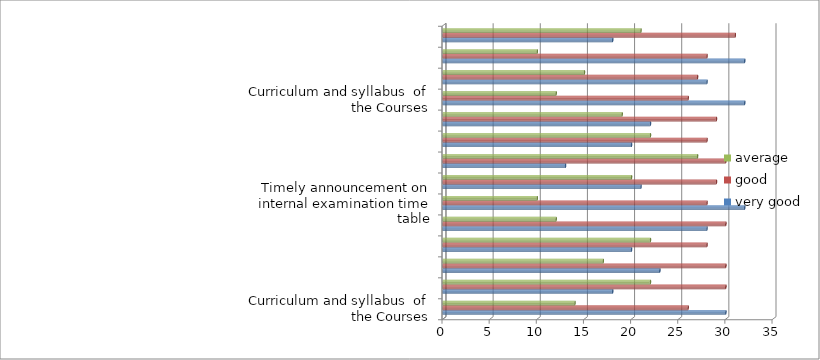
| Category | very good | good | average |
|---|---|---|---|
| Curriculum and syllabus  of the Courses | 30 | 26 | 14 |
| Extent of syllabus covered in the class | 18 | 30 | 22 |
| Courses delivery by faculty members in the class | 23 | 30 | 17 |
| Usage of teaching aids and ICT in the class | 20 | 28 | 22 |
| Fairness in the assessment Process | 28 | 30 | 12 |
| Timely announcement on internal examination time table | 32 | 28 | 10 |
| Opportunities available in the college for best practices/ other activities | 21 | 29 | 20 |
| Opportunities available in the college for students to participate in internship, field visits etc. | 13 | 30 | 27 |
| Opportunities for out of class room learning eg. Guest lectures, Seminars, Workshop Value aided Programmes, Conferences, competitions etc. | 20 | 28 | 22 |
| Overall Learning Experience | 22 | 29 | 19 |
| Curriculum and syllabus  of the Courses | 32 | 26 | 12 |
| Extent of syllabus covered in the class | 28 | 27 | 15 |
| Courses delivery by faculty members in the class | 32 | 28 | 10 |
| Usage of teaching aids and ICT in the class | 18 | 31 | 21 |